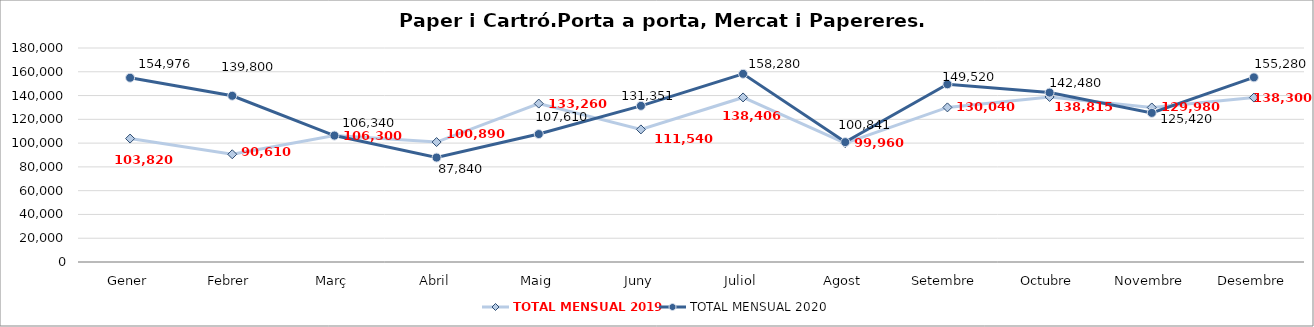
| Category | TOTAL MENSUAL 2019 | TOTAL MENSUAL 2020 |
|---|---|---|
| Gener | 103820 | 154976 |
| Febrer | 90610 | 139800 |
| Març | 106300 | 106340 |
| Abril | 100890 | 87840 |
| Maig | 133260 | 107610 |
| Juny | 111540 | 131351.43 |
| Juliol | 138406 | 158280 |
| Agost | 99960 | 100841 |
| Setembre | 130040 | 149520 |
| Octubre | 138815 | 142480 |
| Novembre | 129980 | 125420 |
| Desembre | 138300 | 155280 |